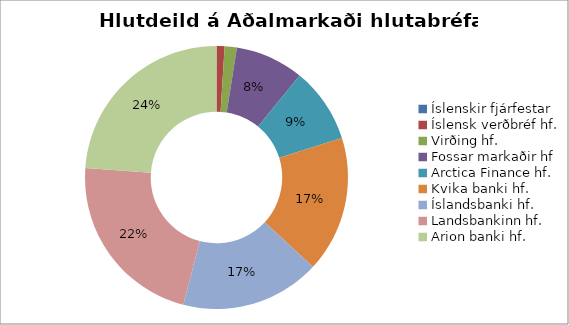
| Category | 2016 |
|---|---|
| Íslenskir fjárfestar | 0 |
| Íslensk verðbréf hf. | 0.01 |
| Virðing hf. | 0.015 |
| Fossar markaðir hf | 0.084 |
| Arctica Finance hf. | 0.093 |
| Kvika banki hf. | 0.167 |
| Íslandsbanki hf. | 0.172 |
| Landsbankinn hf. | 0.221 |
| Arion banki hf. | 0.238 |